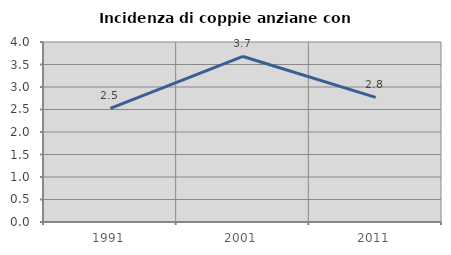
| Category | Incidenza di coppie anziane con figli |
|---|---|
| 1991.0 | 2.526 |
| 2001.0 | 3.678 |
| 2011.0 | 2.77 |